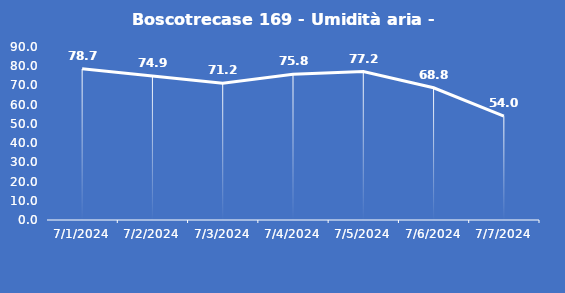
| Category | Boscotrecase 169 - Umidità aria - Grezzo (%) |
|---|---|
| 7/1/24 | 78.7 |
| 7/2/24 | 74.9 |
| 7/3/24 | 71.2 |
| 7/4/24 | 75.8 |
| 7/5/24 | 77.2 |
| 7/6/24 | 68.8 |
| 7/7/24 | 54 |